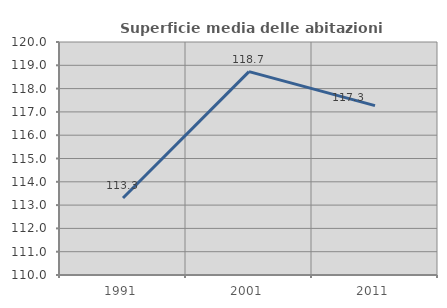
| Category | Superficie media delle abitazioni occupate |
|---|---|
| 1991.0 | 113.302 |
| 2001.0 | 118.727 |
| 2011.0 | 117.268 |